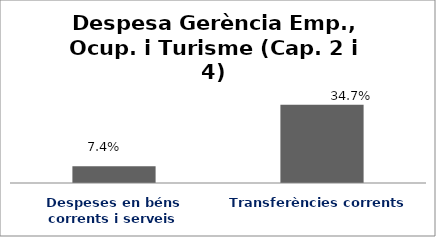
| Category | Series 0 |
|---|---|
| Despeses en béns corrents i serveis | 0.074 |
| Transferències corrents | 0.347 |